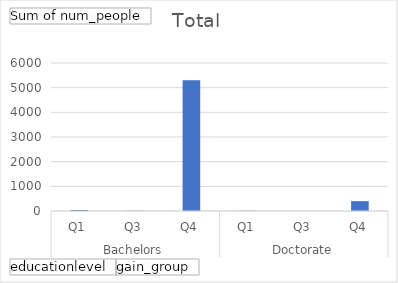
| Category | Total |
|---|---|
| 0 | 41 |
| 1 | 12 |
| 2 | 5302 |
| 3 | 12 |
| 4 | 1 |
| 5 | 400 |